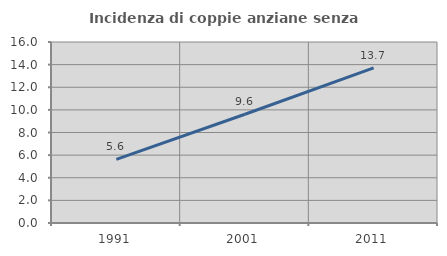
| Category | Incidenza di coppie anziane senza figli  |
|---|---|
| 1991.0 | 5.631 |
| 2001.0 | 9.613 |
| 2011.0 | 13.706 |